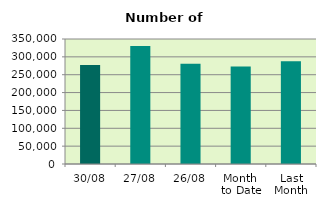
| Category | Series 0 |
|---|---|
| 30/08 | 277544 |
| 27/08 | 330080 |
| 26/08 | 280538 |
| Month 
to Date | 272988.476 |
| Last
Month | 287917.636 |